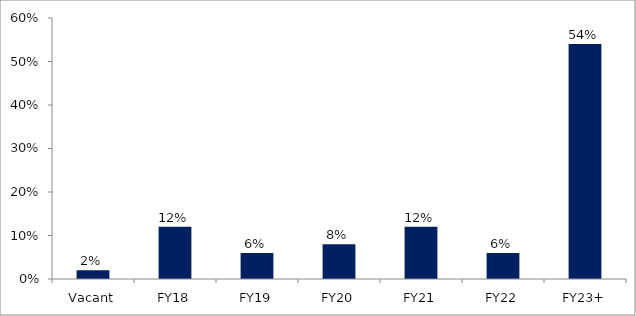
| Category | Series 0 |
|---|---|
| Vacant | 0.02 |
| FY18 | 0.12 |
| FY19 | 0.06 |
| FY20 | 0.08 |
| FY21 | 0.12 |
| FY22 | 0.06 |
| FY23+ | 0.54 |